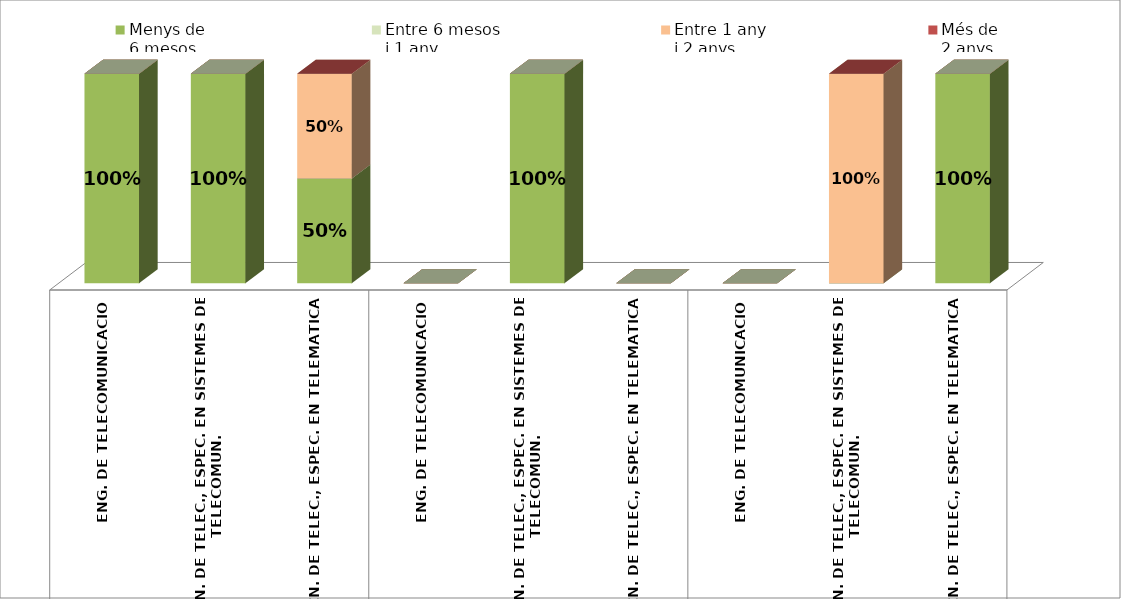
| Category | Menys de 
6 mesos | Entre 6 mesos
i 1 any | Entre 1 any
i 2 anys | Més de
2 anys |
|---|---|---|---|---|
| 0 | 1 | 0 | 0 | 0 |
| 1 | 1 | 0 | 0 | 0 |
| 2 | 0.5 | 0 | 0.5 | 0 |
| 3 | 0 | 0 | 0 | 0 |
| 4 | 1 | 0 | 0 | 0 |
| 5 | 0 | 0 | 0 | 0 |
| 6 | 0 | 0 | 0 | 0 |
| 7 | 0 | 0 | 1 | 0 |
| 8 | 1 | 0 | 0 | 0 |